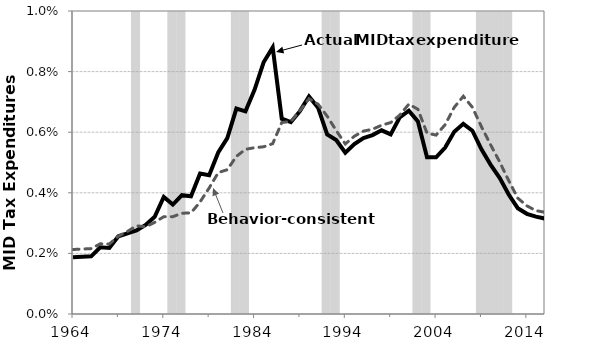
| Category | High Unemployment |
|---|---|
| 1964.0 | 0 |
| 1965.0 | 0 |
| 1966.0 | 0 |
| 1967.0 | 0 |
| 1968.0 | 0 |
| 1969.0 | 0 |
| 1970.0 | 0 |
| 1971.0 | 1 |
| 1972.0 | 0 |
| 1973.0 | 0 |
| 1974.0 | 0 |
| 1975.0 | 1 |
| 1976.0 | 1 |
| 1977.0 | 0 |
| 1978.0 | 0 |
| 1979.0 | 0 |
| 1980.0 | 0 |
| 1981.0 | 0 |
| 1982.0 | 1 |
| 1983.0 | 1 |
| 1984.0 | 0 |
| 1985.0 | 0 |
| 1986.0 | 0 |
| 1987.0 | 0 |
| 1988.0 | 0 |
| 1989.0 | 0 |
| 1990.0 | 0 |
| 1991.0 | 0 |
| 1992.0 | 1 |
| 1993.0 | 1 |
| 1994.0 | 0 |
| 1995.0 | 0 |
| 1996.0 | 0 |
| 1997.0 | 0 |
| 1998.0 | 0 |
| 1999.0 | 0 |
| 2000.0 | 0 |
| 2001.0 | 0 |
| 2002.0 | 1 |
| 2003.0 | 1 |
| 2004.0 | 0 |
| 2005.0 | 0 |
| 2006.0 | 0 |
| 2007.0 | 0 |
| 2008.0 | 0 |
| 2009.0 | 1 |
| 2010.0 | 1 |
| 2011.0 | 1 |
| 2012.0 | 1 |
| 2013.0 | 0 |
| 2014.0 | 0 |
| 2015.0 | 0 |
| 2016.0 | 0 |